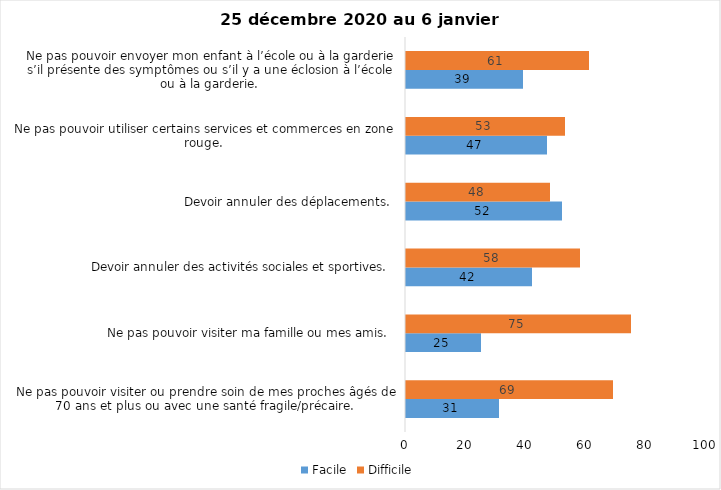
| Category | Facile | Difficile |
|---|---|---|
| Ne pas pouvoir visiter ou prendre soin de mes proches âgés de 70 ans et plus ou avec une santé fragile/précaire.  | 31 | 69 |
| Ne pas pouvoir visiter ma famille ou mes amis.  | 25 | 75 |
| Devoir annuler des activités sociales et sportives.  | 42 | 58 |
| Devoir annuler des déplacements.  | 52 | 48 |
| Ne pas pouvoir utiliser certains services et commerces en zone rouge.  | 47 | 53 |
| Ne pas pouvoir envoyer mon enfant à l’école ou à la garderie s’il présente des symptômes ou s’il y a une éclosion à l’école ou à la garderie.  | 39 | 61 |